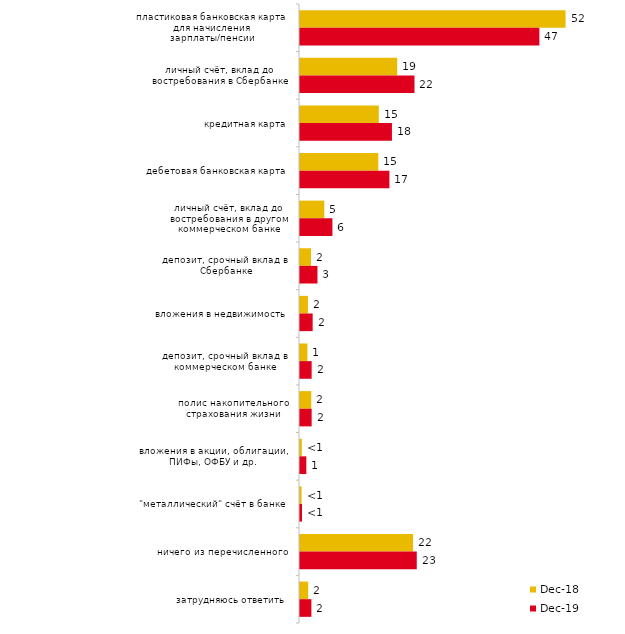
| Category | дек.18 | дек.19 |
|---|---|---|
| пластиковая банковская карта для начисления зарплаты/пенсии | 51.9 | 46.782 |
| личный счёт, вклад до востребования в Сбербанке | 19 | 22.376 |
| кредитная карта | 15.4 | 17.97 |
| дебетовая банковская карта | 15.3 | 17.475 |
| личный счёт, вклад до востребования в другом коммерческом банке | 4.75 | 6.337 |
| депозит, срочный вклад в Сбербанке | 2.15 | 3.416 |
| вложения в недвижимость | 1.55 | 2.475 |
| депозит, срочный вклад в коммерческом банке | 1.45 | 2.277 |
| полис накопительного страхования жизни | 2.2 | 2.277 |
| вложения в акции, облигации, ПИФы, ОФБУ и др. | 0.35 | 1.238 |
| "металлический" счёт в банке | 0.3 | 0.396 |
| ничего из перечисленного | 22.1 | 22.822 |
| затрудняюсь ответить | 1.6 | 2.228 |